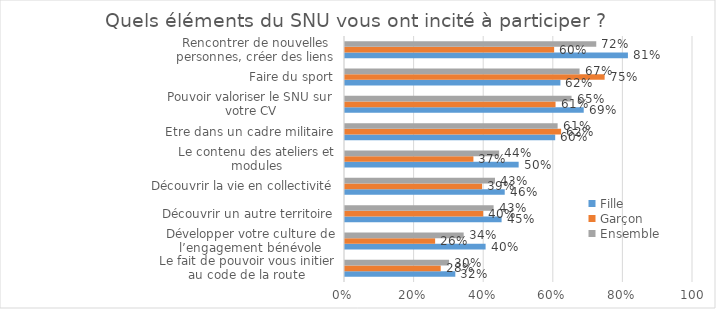
| Category | Fille | Garçon | Ensemble |
|---|---|---|---|
| Le fait de pouvoir vous initier au code de la route | 0.317 | 0.275 | 0.299 |
| Développer votre culture de l’engagement bénévole | 0.404 | 0.259 | 0.341 |
| Découvrir un autre territoire | 0.45 | 0.397 | 0.427 |
| Découvrir la vie en collectivité | 0.459 | 0.394 | 0.431 |
| Le contenu des ateliers et modules | 0.499 | 0.369 | 0.443 |
| Etre dans un cadre militaire | 0.604 | 0.621 | 0.611 |
| Pouvoir valoriser le SNU sur votre CV | 0.686 | 0.605 | 0.651 |
| Faire du sport | 0.619 | 0.746 | 0.674 |
| Rencontrer de nouvelles personnes, créer des liens nouveaux | 0.813 | 0.601 | 0.722 |